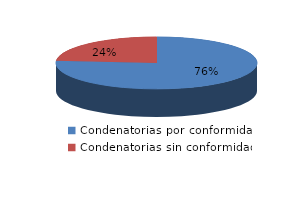
| Category | Series 0 |
|---|---|
| 0 | 326 |
| 1 | 101 |